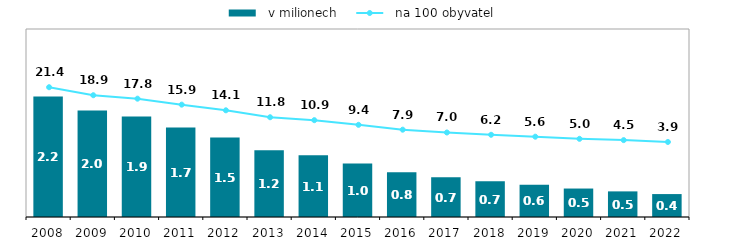
| Category |   v milionech |
|---|---|
| 2008.0 | 2.242 |
| 2009.0 | 1.982 |
| 2010.0 | 1.871 |
| 2011.0 | 1.666 |
| 2012.0 | 1.478 |
| 2013.0 | 1.245 |
| 2014.0 | 1.149 |
| 2015.0 | 0.994 |
| 2016.0 | 0.832 |
| 2017.0 | 0.74 |
| 2018.0 | 0.665 |
| 2019.0 | 0.602 |
| 2020.0 | 0.53 |
| 2021.0 | 0.477 |
| 2022.0 | 0.427 |